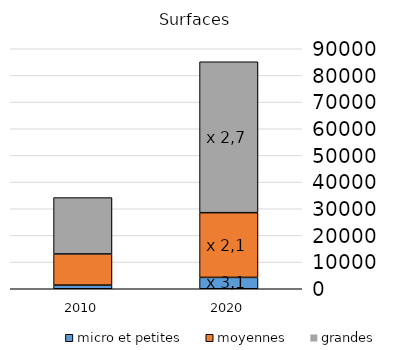
| Category | micro et petites | moyennes | grandes |
|---|---|---|---|
| 2010.0 | 1365.5 | 11688.56 | 21134.53 |
| 2020.0 | 4254.12 | 24279.8 | 56587.39 |